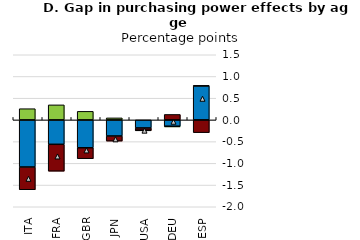
| Category | Energy | Food | Other: (non-food, non-energy) |
|---|---|---|---|
| ITA | -1.085 | -0.523 | 0.258 |
| FRA | -0.562 | -0.62 | 0.346 |
| GBR | -0.642 | -0.252 | 0.197 |
| JPN | -0.371 | -0.117 | 0.046 |
| USA | -0.186 | -0.055 | -0.001 |
| DEU | -0.145 | 0.126 | -0.017 |
| ESP | 0.784 | -0.293 | 0.001 |